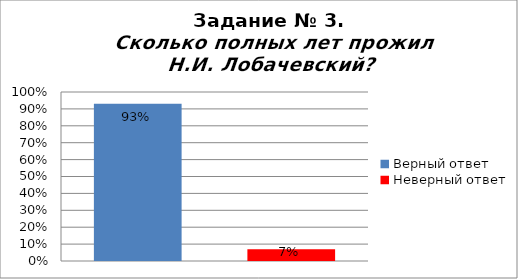
| Category | Сколько полных лет прожил Н.И. Лобачевский? |
|---|---|
| Верный ответ | 0.93 |
| Неверный ответ | 0.07 |